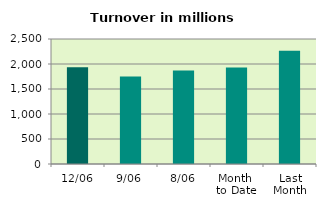
| Category | Series 0 |
|---|---|
| 12/06 | 1932.939 |
| 9/06 | 1748.509 |
| 8/06 | 1868.349 |
| Month 
to Date | 1929.568 |
| Last
Month | 2265.206 |